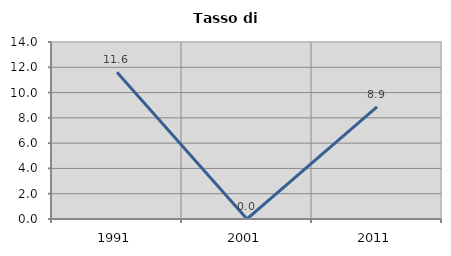
| Category | Tasso di disoccupazione   |
|---|---|
| 1991.0 | 11.607 |
| 2001.0 | 0 |
| 2011.0 | 8.871 |